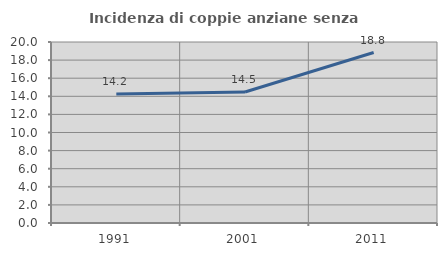
| Category | Incidenza di coppie anziane senza figli  |
|---|---|
| 1991.0 | 14.242 |
| 2001.0 | 14.478 |
| 2011.0 | 18.836 |